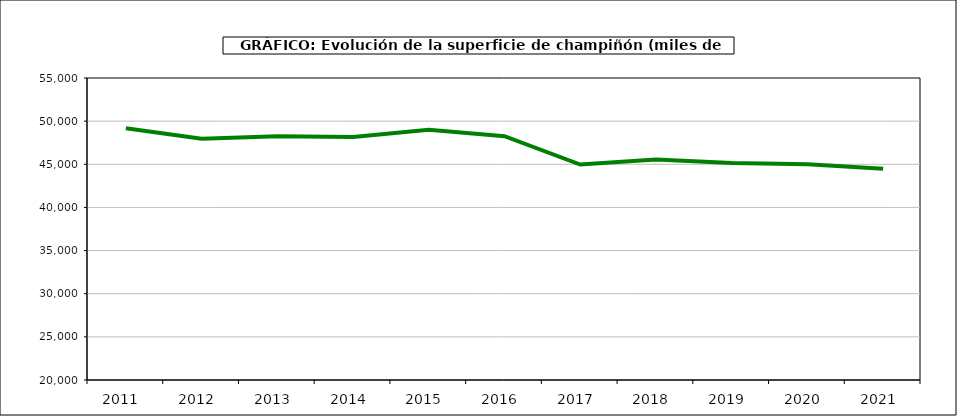
| Category | superficie |
|---|---|
| 2011.0 | 49173 |
| 2012.0 | 47970 |
| 2013.0 | 48261 |
| 2014.0 | 48171 |
| 2015.0 | 48998 |
| 2016.0 | 48254 |
| 2017.0 | 44974 |
| 2018.0 | 45565 |
| 2019.0 | 45141 |
| 2020.0 | 44992 |
| 2021.0 | 44489 |